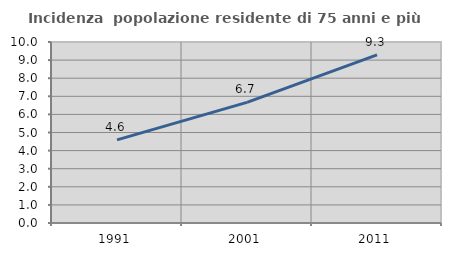
| Category | Incidenza  popolazione residente di 75 anni e più |
|---|---|
| 1991.0 | 4.59 |
| 2001.0 | 6.664 |
| 2011.0 | 9.289 |